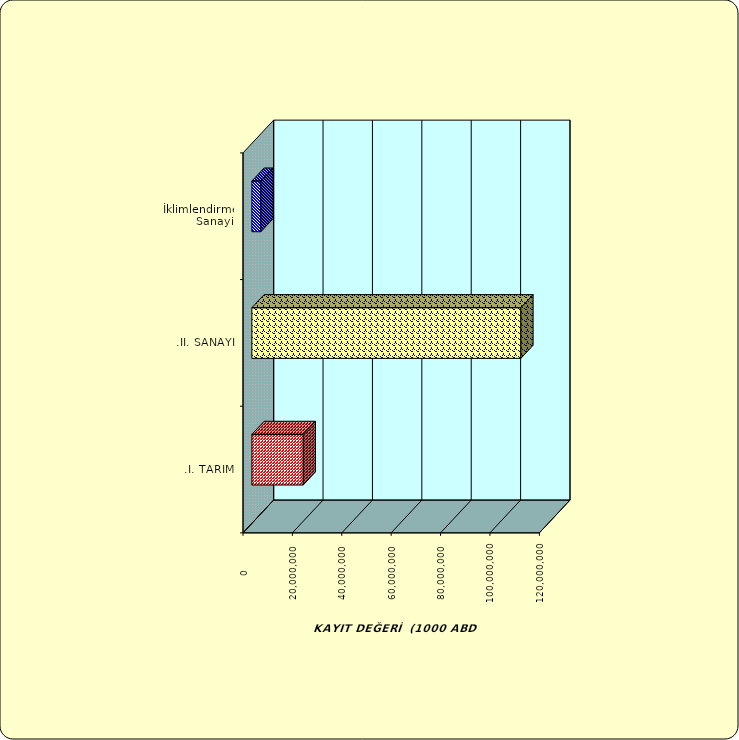
| Category | Series 0 |
|---|---|
| .I. TARIM | 20788489.841 |
| .II. SANAYİ | 108916608.71 |
|  İklimlendirme Sanayii | 3648873.545 |